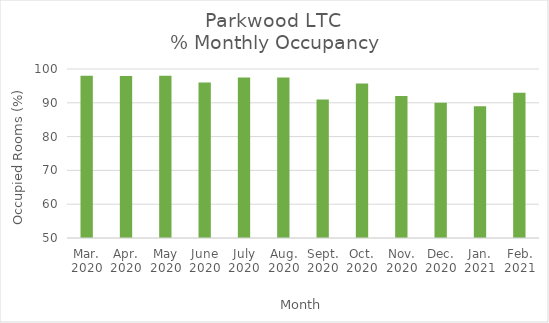
| Category | % Monthly Occupancy |
|---|---|
| Mar.
2020 | 98 |
| Apr.
2020 | 97.95 |
| May
2020 | 98 |
| June
2020 | 96 |
| July
2020 | 97.5 |
| Aug.
2020 | 97.5 |
| Sept.
2020 | 91 |
| Oct.
2020 | 95.7 |
| Nov.
2020 | 92 |
| Dec.
2020 | 90 |
| Jan.
2021 | 89 |
| Feb.
2021 | 93 |